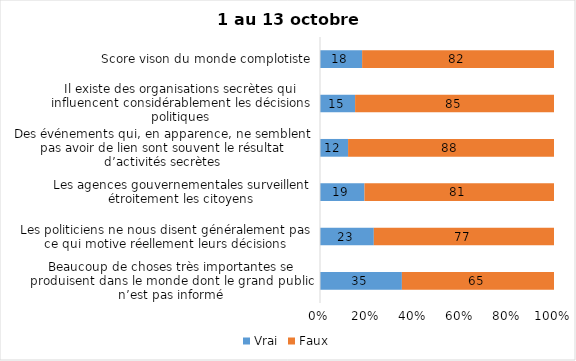
| Category | Vrai | Faux |
|---|---|---|
| Beaucoup de choses très importantes se produisent dans le monde dont le grand public n’est pas informé | 35 | 65 |
| Les politiciens ne nous disent généralement pas ce qui motive réellement leurs décisions | 23 | 77 |
| Les agences gouvernementales surveillent étroitement les citoyens | 19 | 81 |
| Des événements qui, en apparence, ne semblent pas avoir de lien sont souvent le résultat d’activités secrètes | 12 | 88 |
| Il existe des organisations secrètes qui influencent considérablement les décisions politiques | 15 | 85 |
| Score vison du monde complotiste | 18 | 82 |